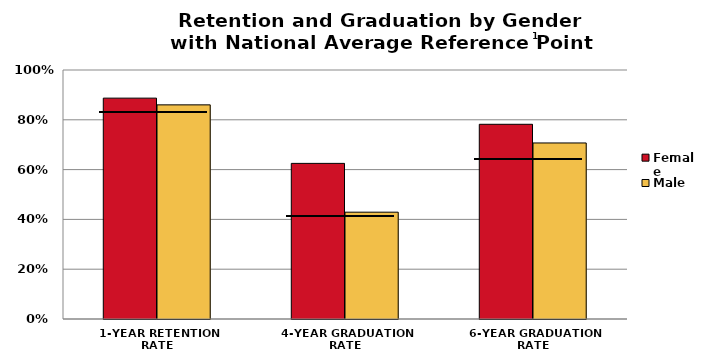
| Category | Female | Male |
|---|---|---|
| 1-YEAR RETENTION RATE | 0.887 | 0.86 |
| 4-YEAR GRADUATION RATE | 0.625 | 0.429 |
| 6-YEAR GRADUATION RATE | 0.782 | 0.707 |